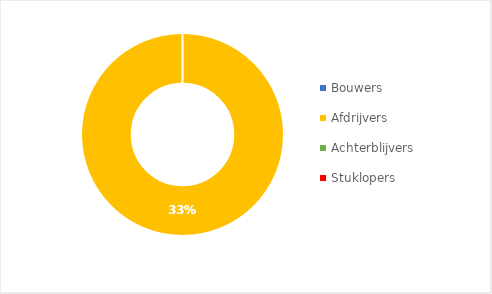
| Category | Series 0 |
|---|---|
| Bouwers | 0 |
| Afdrijvers | 0.333 |
| Achterblijvers | 0 |
| Stuklopers | 0 |